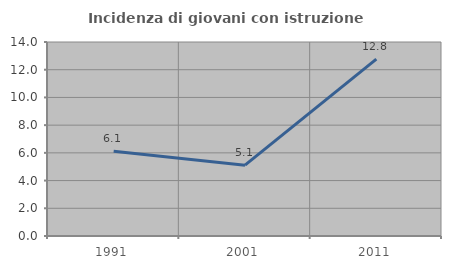
| Category | Incidenza di giovani con istruzione universitaria |
|---|---|
| 1991.0 | 6.122 |
| 2001.0 | 5.109 |
| 2011.0 | 12.766 |